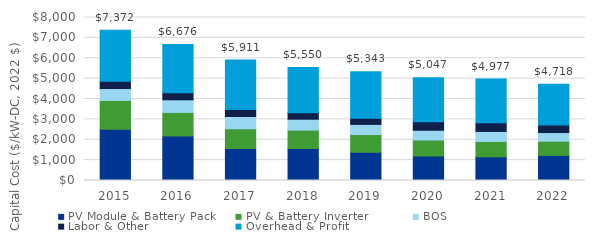
| Category | PV Module & Battery Pack | PV & Battery Inverter | BOS | Labor & Other | Overhead & Profit |
|---|---|---|---|---|---|
| 2015.0 | 2514.161 | 1414.029 | 583.64 | 364.597 | 2495.7 |
| 2016.0 | 2187.679 | 1153.531 | 620.967 | 341.478 | 2372.559 |
| 2017.0 | 1567.221 | 973.091 | 599.531 | 343.91 | 2427.006 |
| 2018.0 | 1572.754 | 900.245 | 534.677 | 319.083 | 2223.516 |
| 2019.0 | 1387.205 | 867.681 | 498.655 | 302.601 | 2287.093 |
| 2020.0 | 1203.851 | 780.982 | 484.989 | 417.832 | 2159.6 |
| 2021.0 | 1163.398 | 752.857 | 491.877 | 421.358 | 2147.783 |
| 2022.0 | 1232.877 | 698.165 | 421.386 | 376.943 | 1988.507 |